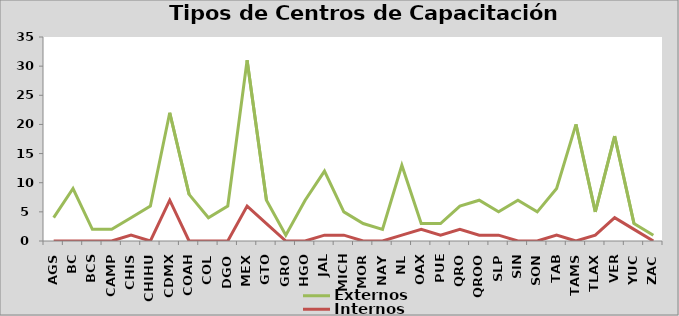
| Category | Externos | Internos |
|---|---|---|
| AGS | 4 | 0 |
| BC | 9 | 0 |
| BCS | 2 | 0 |
| CAMP | 2 | 0 |
| CHIS | 4 | 1 |
| CHIHU | 6 | 0 |
| CDMX | 22 | 7 |
| COAH | 8 | 0 |
| COL | 4 | 0 |
| DGO | 6 | 0 |
| MEX | 31 | 6 |
| GTO | 7 | 3 |
| GRO | 1 | 0 |
| HGO | 7 | 0 |
| JAL | 12 | 1 |
| MICH | 5 | 1 |
| MOR | 3 | 0 |
| NAY | 2 | 0 |
| NL | 13 | 1 |
| OAX | 3 | 2 |
| PUE | 3 | 1 |
| QRO | 6 | 2 |
| QROO | 7 | 1 |
| SLP | 5 | 1 |
| SIN | 7 | 0 |
| SON | 5 | 0 |
| TAB | 9 | 1 |
| TAMS | 20 | 0 |
| TLAX | 5 | 1 |
| VER | 18 | 4 |
| YUC | 3 | 2 |
| ZAC | 1 | 0 |